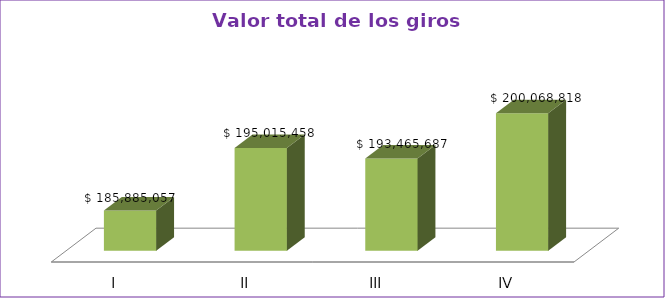
| Category | Series 0 |
|---|---|
| I | 185885057 |
| II | 195015458 |
| III | 193465687 |
| IV | 200068818 |